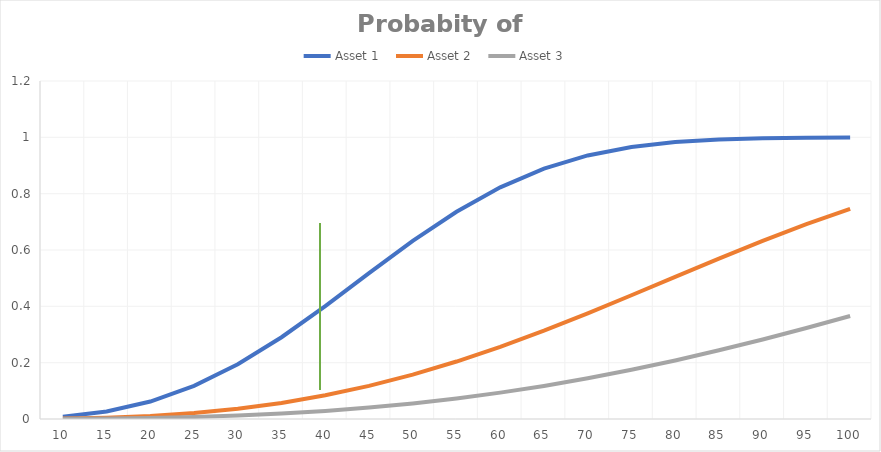
| Category | Asset 1 | Asset 2 | Asset 3 |
|---|---|---|---|
| 10.0 | 0.008 | 0.001 | 0 |
| 15.0 | 0.027 | 0.005 | 0.002 |
| 20.0 | 0.062 | 0.011 | 0.004 |
| 25.0 | 0.118 | 0.021 | 0.007 |
| 30.0 | 0.194 | 0.036 | 0.012 |
| 35.0 | 0.29 | 0.057 | 0.019 |
| 40.0 | 0.401 | 0.084 | 0.029 |
| 45.0 | 0.518 | 0.118 | 0.041 |
| 50.0 | 0.632 | 0.158 | 0.055 |
| 55.0 | 0.736 | 0.204 | 0.073 |
| 60.0 | 0.822 | 0.256 | 0.094 |
| 65.0 | 0.889 | 0.314 | 0.118 |
| 70.0 | 0.936 | 0.375 | 0.145 |
| 75.0 | 0.966 | 0.439 | 0.175 |
| 80.0 | 0.983 | 0.505 | 0.208 |
| 85.0 | 0.993 | 0.569 | 0.244 |
| 90.0 | 0.997 | 0.632 | 0.282 |
| 95.0 | 0.999 | 0.692 | 0.323 |
| 100.0 | 1 | 0.746 | 0.366 |